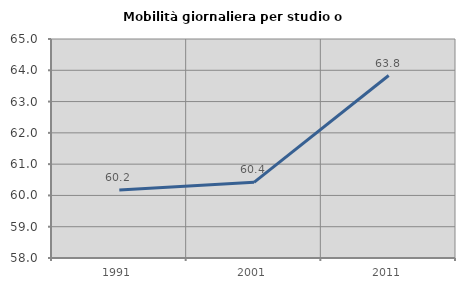
| Category | Mobilità giornaliera per studio o lavoro |
|---|---|
| 1991.0 | 60.177 |
| 2001.0 | 60.418 |
| 2011.0 | 63.832 |